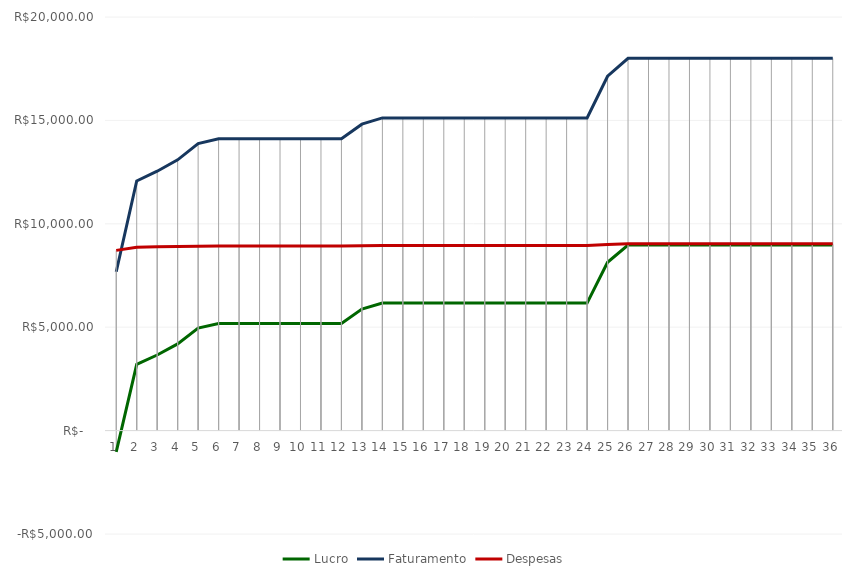
| Category | Lucro | Faturamento | Despesas |
|---|---|---|---|
| 0 | -1032.464 | 7683.2 | 8715.664 |
| 1 | 3204.272 | 12073.6 | 8869.328 |
| 2 | 3655.856 | 12544 | 8888.144 |
| 3 | 4193.68 | 13092.8 | 8899.12 |
| 4 | 4957.296 | 13876.8 | 8919.504 |
| 5 | 5183.088 | 14112 | 8928.912 |
| 6 | 5183.088 | 14112 | 8928.912 |
| 7 | 5183.088 | 14112 | 8928.912 |
| 8 | 5183.088 | 14112 | 8928.912 |
| 9 | 5183.088 | 14112 | 8928.912 |
| 10 | 5183.088 | 14112 | 8928.912 |
| 11 | 5183.088 | 14112 | 8928.912 |
| 12 | 5874.576 | 14817.6 | 8943.024 |
| 13 | 6164.88 | 15120 | 8955.12 |
| 14 | 6164.88 | 15120 | 8955.12 |
| 15 | 6164.88 | 15120 | 8955.12 |
| 16 | 6164.88 | 15120 | 8955.12 |
| 17 | 6164.88 | 15120 | 8955.12 |
| 18 | 6164.88 | 15120 | 8955.12 |
| 19 | 6164.88 | 15120 | 8955.12 |
| 20 | 6164.88 | 15120 | 8955.12 |
| 21 | 6164.88 | 15120 | 8955.12 |
| 22 | 6164.88 | 15120 | 8955.12 |
| 23 | 6164.88 | 15120 | 8955.12 |
| 24 | 8140.56 | 17136 | 8995.44 |
| 25 | 8970 | 18000 | 9030 |
| 26 | 8970 | 18000 | 9030 |
| 27 | 8970 | 18000 | 9030 |
| 28 | 8970 | 18000 | 9030 |
| 29 | 8970 | 18000 | 9030 |
| 30 | 8970 | 18000 | 9030 |
| 31 | 8970 | 18000 | 9030 |
| 32 | 8970 | 18000 | 9030 |
| 33 | 8970 | 18000 | 9030 |
| 34 | 8970 | 18000 | 9030 |
| 35 | 8970 | 18000 | 9030 |